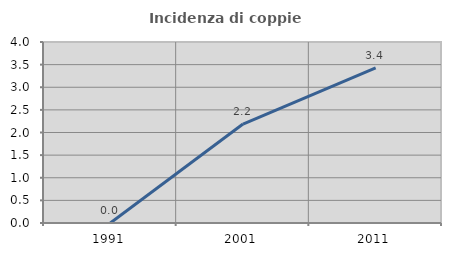
| Category | Incidenza di coppie miste |
|---|---|
| 1991.0 | 0 |
| 2001.0 | 2.188 |
| 2011.0 | 3.43 |